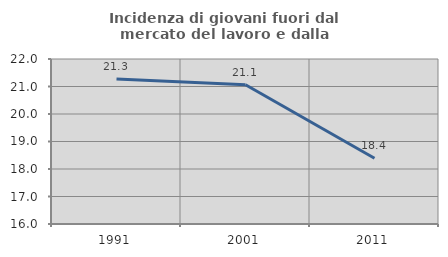
| Category | Incidenza di giovani fuori dal mercato del lavoro e dalla formazione  |
|---|---|
| 1991.0 | 21.277 |
| 2001.0 | 21.064 |
| 2011.0 | 18.391 |